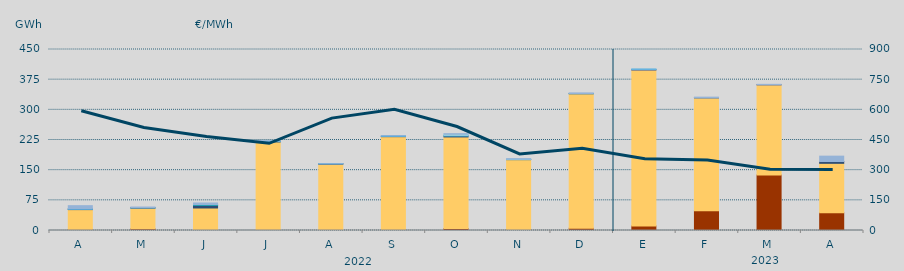
| Category | Carbón | Ciclo Combinado | Cogeneración | Consumo Bombeo | Enlace Península Baleares | Eólica | Hidráulica | Internacionales | Otras Renovables | Residuos no Renovables | Solar fotovoltaica | Solar térmica | Turbinación bombeo |
|---|---|---|---|---|---|---|---|---|---|---|---|---|---|
| A | 2650 | 49297.5 | 0 | 1035.9 | 250 | 0 | 506.1 | 0 | 0 | 0 | 0 | 0 | 8012.5 |
| M | 4151 | 51455.8 | 0 | 906.775 | 0 | 0 | 22.4 | 0 | 0 | 0 | 0 | 0 | 1817.044 |
| J | 865 | 55112.458 | 0 | 7229.298 | 0 | 0.5 | 1411.333 | 0 | 0 | 0 | 0 | 0 | 3733.801 |
| J | 60 | 220106.232 | 0 | 916.465 | 0 | 0 | 693.475 | 0 | 0 | 0 | 0 | 0 | 1555.3 |
| A | 115 | 164760.775 | 0 | 1020.576 | 102 | 0 | 100 | 0 | 0 | 0 | 0 | 0 | 81.25 |
| S | 555 | 232710.6 | 0 | 982.5 | 388.7 | 0 | 418.25 | 0 | 0 | 0 | 0 | 0 | 708.4 |
| O | 4836.8 | 227776.455 | 0 | 2792.6 | 0 | 0 | 208.75 | 3824.8 | 0 | 0 | 0 | 0 | 1365.5 |
| N | 2212.7 | 174006.854 | 0 | 126 | 0 | 0 | 449.2 | 613.333 | 0 | 0 | 0 | 0 | 1312.25 |
| D | 5478 | 334554.358 | 0 | 258.25 | 0 | 0 | 227.925 | 0 | 0 | 0 | 0 | 0 | 1594.663 |
| E | 11268 | 387716.675 | 0 | 572.573 | 681.8 | 0 | 835.85 | 0 | 0 | 0 | 0 | 0 | 77.5 |
| F | 48958 | 280733.853 | 0 | 43.033 | 0 | 0 | 0 | 0 | 0 | 0 | 0 | 0 | 1846.75 |
| M | 138130.4 | 224071.017 | 0 | 316.875 | 152.4 | 0 | 0 | 0 | 0 | 0 | 0 | 0 | 717.667 |
| A | 43920 | 123105.6 | 0 | 4435.017 | 148.1 | 0 | 0 | 0 | 0 | 0 | 0 | 0 | 13251.877 |